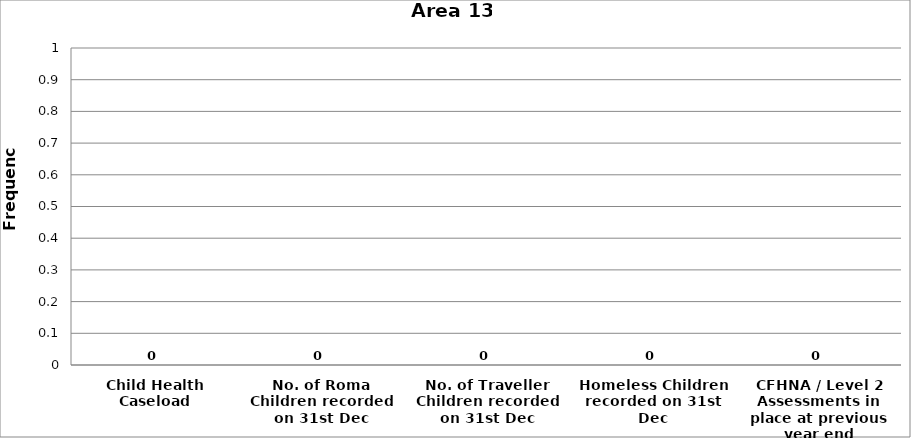
| Category | Area 13 |
|---|---|
| Child Health Caseload | 0 |
| No. of Roma Children recorded on 31st Dec | 0 |
| No. of Traveller Children recorded on 31st Dec | 0 |
| Homeless Children recorded on 31st Dec | 0 |
| CFHNA / Level 2 Assessments in place at previous year end | 0 |